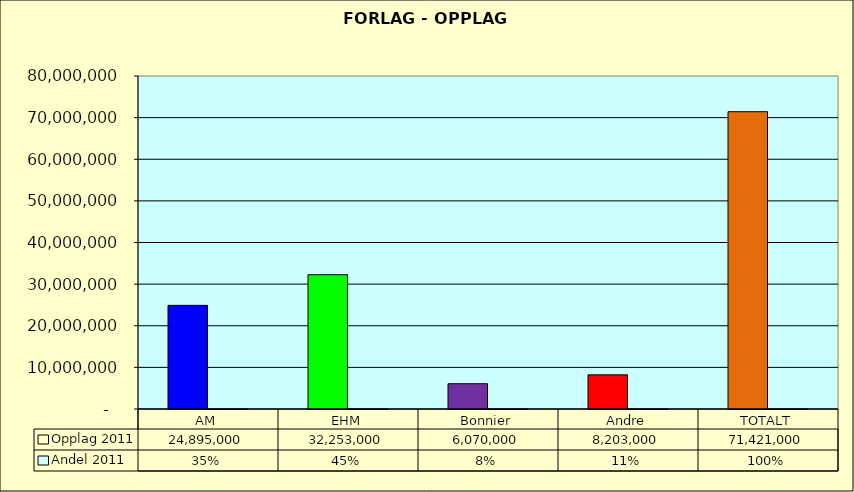
| Category | Opplag 2011 | Andel 2011 |
|---|---|---|
| AM | 24895000 | 0.349 |
| EHM | 32253000 | 0.452 |
| Bonnier | 6070000 | 0.085 |
| Andre | 8203000 | 0.115 |
| TOTALT | 71421000 | 1 |